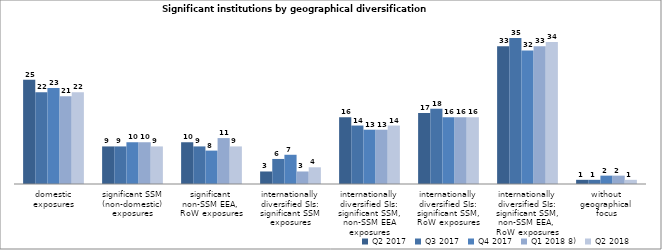
| Category | Q2 2017 | Q3 2017 | Q4 2017 | Q1 2018 8) | Q2 2018 |
|---|---|---|---|---|---|
| domestic exposures | 25 | 22 | 23 | 21 | 22 |
| significant SSM
(non-domestic) exposures | 9 | 9 | 10 | 10 | 9 |
| significant 
non-SSM EEA, 
RoW exposures | 10 | 9 | 8 | 11 | 9 |
| internationally
diversified SIs:
significant SSM
exposures | 3 | 6 | 7 | 3 | 4 |
| internationally
diversified SIs:
significant SSM,
non-SSM EEA
exposures | 16 | 14 | 13 | 13 | 14 |
| internationally diversified SIs:
significant SSM,
RoW exposures | 17 | 18 | 16 | 16 | 16 |
| internationally diversified SIs:
significant SSM,
non-SSM EEA, 
RoW exposures | 33 | 35 | 32 | 33 | 34 |
| without geographical focus | 1 | 1 | 2 | 2 | 1 |